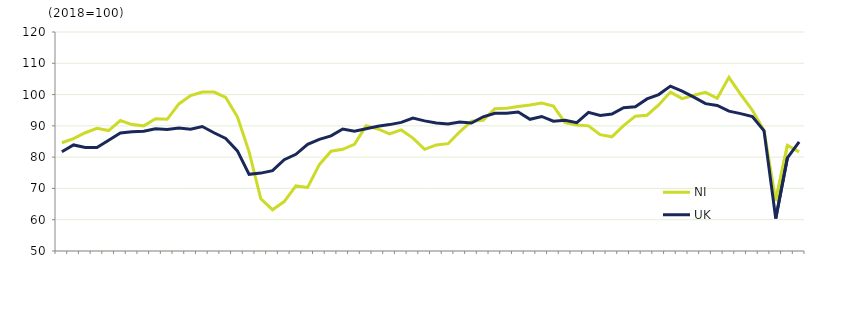
| Category | NI | UK  |
|---|---|---|
|  | 84.6 | 81.7 |
| Q2 2005 | 85.9 | 83.9 |
|  | 87.8 | 83.1 |
| Q4 2005 | 89.2 | 83.1 |
|  | 88.5 | 85.4 |
| Q2 2006 | 91.7 | 87.7 |
|  | 90.4 | 88.1 |
| Q4 2006 | 90 | 88.3 |
|  | 92.3 | 89.1 |
| Q2 2007 | 92.1 | 88.8 |
|  | 97 | 89.3 |
| Q4 2007 | 99.7 | 88.9 |
|  | 100.8 | 89.8 |
| Q2 2008 | 100.8 | 87.8 |
|  | 99.1 | 86 |
| Q4 2008 | 92.9 | 82 |
|  | 81.7 | 74.5 |
| Q2 2009 | 66.7 | 74.9 |
|  | 63.2 | 75.7 |
| Q4 2009 | 65.8 | 79.2 |
|  | 70.8 | 80.9 |
| Q2 2010 | 70.3 | 84.1 |
|  | 77.6 | 85.7 |
| Q4 2010 | 81.9 | 86.8 |
|  | 82.5 | 89 |
| Q2 2011 | 84.1 | 88.3 |
|  | 90 | 89.1 |
| Q4 2011 | 89 | 89.9 |
|  | 87.4 | 90.4 |
| Q2 2012 | 88.7 | 91.1 |
|  | 86.1 | 92.5 |
| Q4 2012 | 82.5 | 91.6 |
|  | 83.9 | 90.9 |
| Q2 2013 | 84.3 | 90.6 |
|  | 88.1 | 91.2 |
| Q4 2013 | 91.5 | 90.9 |
|  | 91.8 | 92.9 |
| Q2 2014 | 95.5 | 94 |
|  | 95.6 | 94 |
| Q4 2014 | 96.2 | 94.4 |
|  | 96.7 | 92.1 |
| Q2 2015 | 97.3 | 93 |
|  | 96.3 | 91.5 |
| Q4 2015 | 91 | 91.8 |
|  | 90.3 | 91 |
| Q2 2016 | 90 | 94.3 |
|  | 87.2 | 93.3 |
| Q4 2016 | 86.5 | 93.8 |
|  | 90.1 | 95.8 |
| Q2 2017 | 93.1 | 96.1 |
|  | 93.4 | 98.6 |
| Q4 2017 | 96.7 | 100 |
|  | 100.8 | 102.7 |
| Q2 2018 | 98.7 | 101.1 |
|  | 99.8 | 99.2 |
| Q4 2018 | 100.7 | 97.1 |
|  | 98.8 | 96.5 |
| Q2 2019 | 105.5 | 94.7 |
|  | 100.1 | 93.9 |
| Q4 2019 | 95 | 93 |
|  | 88.5 | 88.4 |
| Q2 2020 | 66.1 | 60.4 |
|  | 83.8 | 79.8 |
| Q4 2020 | 81.7 | 84.9 |